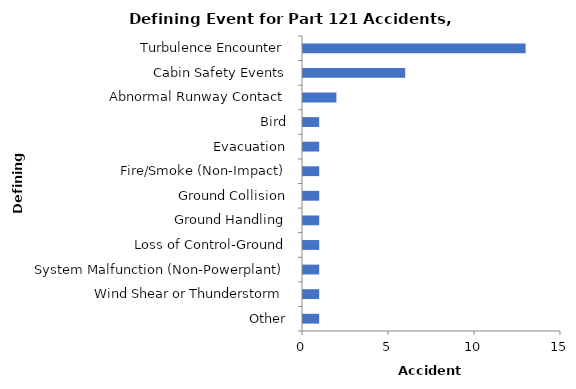
| Category | Accident Aircraft |
|---|---|
| Turbulence Encounter | 13 |
| Cabin Safety Events | 6 |
| Abnormal Runway Contact | 2 |
| Bird | 1 |
| Evacuation | 1 |
| Fire/Smoke (Non-Impact) | 1 |
| Ground Collision | 1 |
| Ground Handling | 1 |
| Loss of Control-Ground | 1 |
| System Malfunction (Non-Powerplant) | 1 |
| Wind Shear or Thunderstorm | 1 |
| Other | 1 |